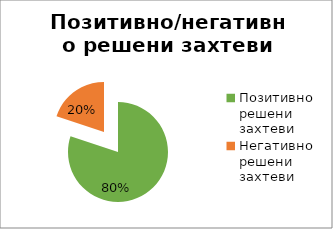
| Category | Series 0 |
|---|---|
| Позитивно решени захтеви | 20499 |
| Негативно решени захтеви | 5104 |